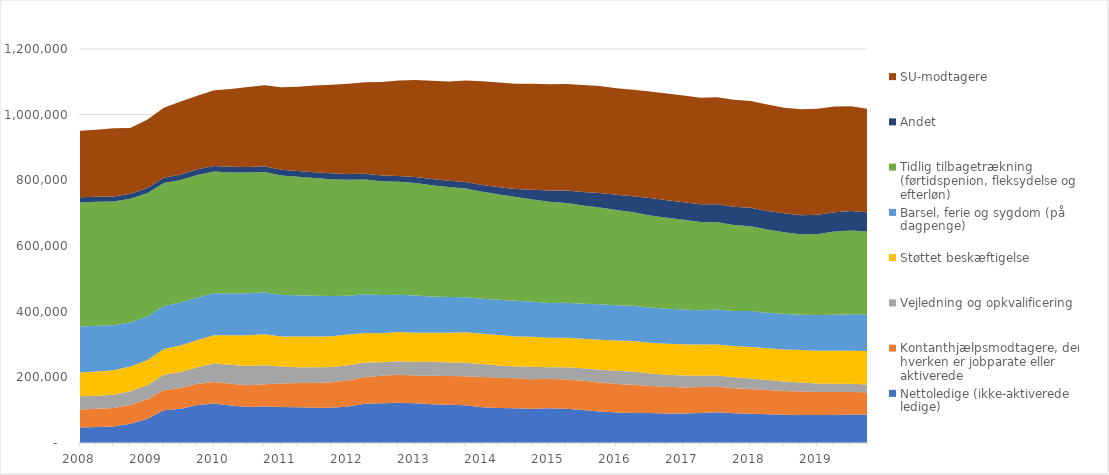
| Category | Nettoledige (ikke-aktiverede ledige) | Kontanthjælpsmodtagere, der hverken er jobparate eller aktiverede | Vejledning og opkvalificering | Støttet beskæftigelse | Barsel, ferie og sygdom (på dagpenge) | Tidlig tilbagetrækning (førtidspenion, fleksydelse og efterløn) | Andet | SU-modtagere |
|---|---|---|---|---|---|---|---|---|
| 2008.0 | 46873 | 55474 | 40056 | 72353 | 139856 | 377553 | 16086 | 202468 |
| nan | 48733 | 55414 | 39982 | 73542 | 139390 | 377343 | 15582 | 203941 |
| nan | 50598 | 56066 | 40392 | 74522 | 136830 | 377122 | 15376 | 207365 |
| nan | 58573 | 57580 | 41376 | 75196 | 134439 | 376442 | 15730 | 200055 |
| 2009.0 | 72886 | 59663 | 43636 | 76221 | 132804 | 375544 | 16125 | 207559 |
| nan | 100114 | 61180 | 46842 | 78016 | 131137 | 374230 | 16544 | 212813 |
| nan | 104239 | 62977 | 48882 | 80486 | 131448 | 373363 | 16705 | 222253 |
| nan | 115574 | 64532 | 50709 | 83009 | 129656 | 372665 | 17312 | 224444 |
| 2010.0 | 120285 | 65141 | 56451 | 86456 | 127490 | 370959 | 17218 | 230072 |
| nan | 114592 | 65876 | 57868 | 89914 | 126893 | 368941 | 17033 | 236775 |
| nan | 109484 | 66308 | 58970 | 93695 | 127725 | 367868 | 16836 | 243022 |
| nan | 111458 | 67673 | 57959 | 94113 | 128168 | 366375 | 16899 | 246931 |
| 2011.0 | 109995 | 70986 | 51650 | 91761 | 126271 | 364321 | 17190 | 251571 |
| nan | 108655 | 74064 | 48237 | 93768 | 125255 | 360993 | 17337 | 257011 |
| nan | 107066 | 75959 | 47355 | 93905 | 124416 | 358125 | 17705 | 264417 |
| nan | 107418 | 77418 | 46777 | 93344 | 122821 | 355505 | 17946 | 270257 |
| 2012.0 | 111042 | 79046 | 46936 | 93388 | 118180 | 352924 | 17868 | 274978 |
| nan | 119847 | 81113 | 44129 | 90092 | 117705 | 349366 | 17883 | 278852 |
| nan | 121066 | 83556 | 41305 | 88111 | 116832 | 346077 | 17883 | 284665 |
| nan | 122731 | 85458 | 40887 | 88620 | 114148 | 343506 | 17639 | 290885 |
| 2013.0 | 120920 | 84904 | 41977 | 87943 | 113643 | 342567 | 18567 | 295346 |
| nan | 118251 | 86209 | 42997 | 87963 | 110494 | 339103 | 18992 | 299221 |
| nan | 116300 | 87621 | 41444 | 90338 | 108952 | 335003 | 19063 | 301943 |
| nan | 114877 | 88792 | 40904 | 92625 | 106986 | 330769 | 19658 | 309785 |
| 2014.0 | 108897 | 92471 | 39011 | 92695 | 106306 | 325960 | 20465 | 315639 |
| nan | 106515 | 92510 | 37340 | 92830 | 107176 | 320662 | 21923 | 319041 |
| nan | 105494 | 91639 | 36179 | 91093 | 109041 | 315774 | 24639 | 320133 |
| nan | 104490 | 90049 | 37672 | 91212 | 106862 | 311627 | 29180 | 322845 |
| 2015.0 | 105472 | 90131 | 35035 | 89584 | 106296 | 308308 | 33905 | 323994 |
| nan | 104454 | 89256 | 36722 | 89975 | 106641 | 303757 | 37871 | 324641 |
| nan | 100402 | 88823 | 38520 | 89464 | 106741 | 299277 | 41272 | 325607 |
| nan | 96319 | 87900 | 39094 | 91251 | 107702 | 294816 | 44393 | 325832 |
| 2016.0 | 92853 | 87074 | 40145 | 92230 | 106920 | 290255 | 46787 | 324470 |
| nan | 91088 | 86198 | 40124 | 93465 | 107043 | 284972 | 48394 | 324765 |
| nan | 91398 | 81854 | 38341 | 93868 | 107006 | 280615 | 53114 | 324608 |
| nan | 90191 | 80916 | 36472 | 94586 | 106939 | 277099 | 53043 | 325423 |
| 2017.0 | 89712 | 79431 | 36402 | 94883 | 105804 | 273412 | 53535 | 324989 |
| nan | 91607 | 78908 | 34626 | 94563 | 104242 | 269081 | 54266 | 324509 |
| nan | 93463 | 77526 | 34313 | 94438 | 107134 | 265181 | 54979 | 325730 |
| nan | 90875 | 76245 | 32941 | 95496 | 106784 | 261593 | 55379 | 325777 |
| 2018.0 | 88935 | 75265 | 31978 | 95958 | 110252 | 257843 | 56102 | 325545 |
| nan | 87641 | 73689 | 30621 | 96705 | 108047 | 253385 | 56604 | 324422 |
| nan | 85966 | 72201 | 29079 | 97245 | 108724 | 248946 | 57261 | 321787 |
| nan | 85186 | 71525 | 27609 | 98576 | 107947 | 245270 | 57642 | 322422 |
| 2019.0 | 85092 | 70559 | 25820 | 99262 | 108817 | 247186 | 58117 | 323150 |
| nan | 85565 | 69705 | 25335 | 100649 | 109233 | 253595 | 58609 | 321951 |
| nan | 86807 | 68889 | 24439 | 101161 | 110966 | 255083 | 59068 | 319222 |
| nan | 86629 | 68091 | 23623 | 101976 | 112141 | 251156 | 59142 | 315171 |